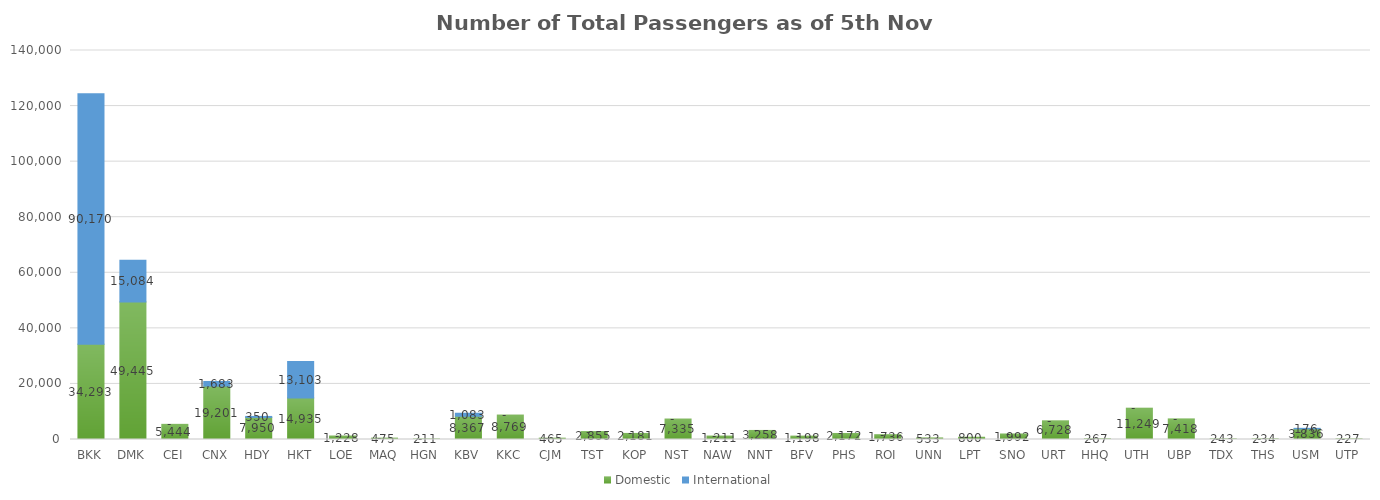
| Category | Domestic | International |
|---|---|---|
| BKK | 34293 | 90170 |
| DMK | 49445 | 15084 |
| CEI | 5444 | 0 |
| CNX | 19201 | 1683 |
| HDY | 7950 | 350 |
| HKT | 14935 | 13103 |
| LOE | 1228 | 0 |
| MAQ | 475 | 0 |
| HGN | 211 | 0 |
| KBV | 8367 | 1083 |
| KKC | 8769 | 0 |
| CJM | 465 | 0 |
| TST | 2855 | 0 |
| KOP | 2181 | 0 |
| NST | 7335 | 0 |
| NAW | 1211 | 0 |
| NNT | 3258 | 0 |
| BFV | 1198 | 0 |
| PHS | 2172 | 0 |
| ROI | 1736 | 0 |
| UNN | 533 | 0 |
| LPT | 800 | 0 |
| SNO | 1992 | 0 |
| URT | 6728 | 0 |
| HHQ | 267 | 0 |
| UTH | 11249 | 0 |
| UBP | 7418 | 0 |
| TDX | 243 | 0 |
| THS | 234 | 0 |
| USM | 3836 | 176 |
| UTP | 227 | 0 |